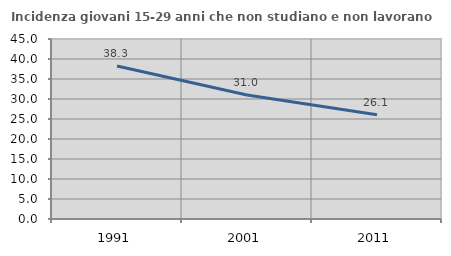
| Category | Incidenza giovani 15-29 anni che non studiano e non lavorano  |
|---|---|
| 1991.0 | 38.272 |
| 2001.0 | 31.016 |
| 2011.0 | 26.061 |